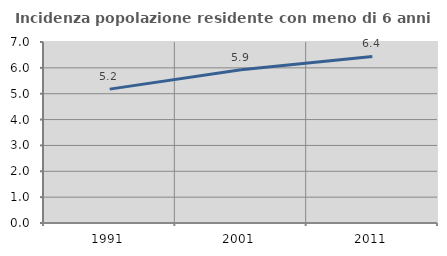
| Category | Incidenza popolazione residente con meno di 6 anni |
|---|---|
| 1991.0 | 5.178 |
| 2001.0 | 5.924 |
| 2011.0 | 6.439 |